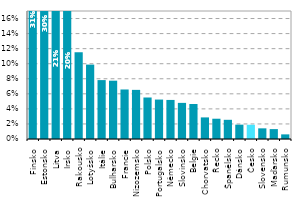
| Category | Series 0 |
|---|---|
| Finsko | 0.313 |
| Estonsko | 0.303 |
| Litva | 0.21 |
| Irsko | 0.205 |
| Rakousko | 0.115 |
| Lotyšsko | 0.099 |
| Itálie | 0.078 |
| Bulharsko | 0.077 |
| Francie | 0.066 |
| Nizozemsko | 0.065 |
| Polsko | 0.055 |
| Portugalsko | 0.052 |
| Německo | 0.052 |
| Slovinsko | 0.048 |
| Belgie | 0.046 |
| Chorvatsko | 0.029 |
| Řecko | 0.027 |
| Španělsko | 0.025 |
| Dánsko | 0.019 |
| Česko | 0.019 |
| Slovensko | 0.014 |
| Maďarsko | 0.013 |
| Rumunsko | 0.006 |